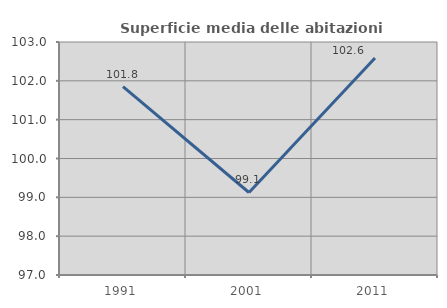
| Category | Superficie media delle abitazioni occupate |
|---|---|
| 1991.0 | 101.849 |
| 2001.0 | 99.125 |
| 2011.0 | 102.587 |